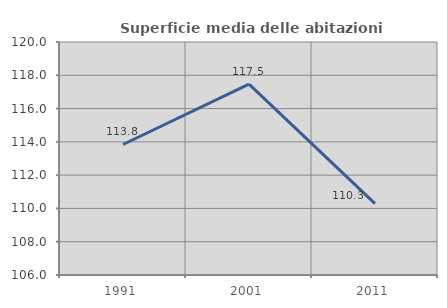
| Category | Superficie media delle abitazioni occupate |
|---|---|
| 1991.0 | 113.842 |
| 2001.0 | 117.464 |
| 2011.0 | 110.286 |